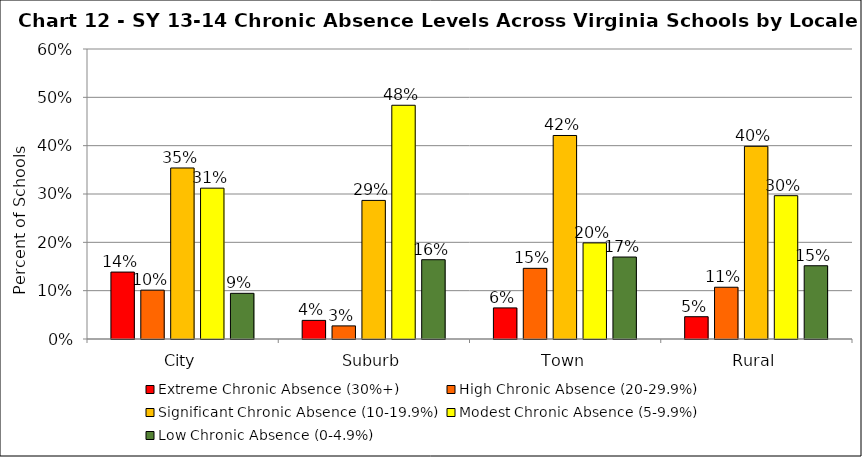
| Category | Extreme Chronic Absence (30%+) | High Chronic Absence (20-29.9%) | Significant Chronic Absence (10-19.9%) | Modest Chronic Absence (5-9.9%) | Low Chronic Absence (0-4.9%) |
|---|---|---|---|---|---|
| 0 | 0.138 | 0.101 | 0.354 | 0.312 | 0.095 |
| 1 | 0.039 | 0.027 | 0.287 | 0.484 | 0.164 |
| 2 | 0.064 | 0.146 | 0.421 | 0.199 | 0.17 |
| 3 | 0.046 | 0.107 | 0.399 | 0.297 | 0.152 |